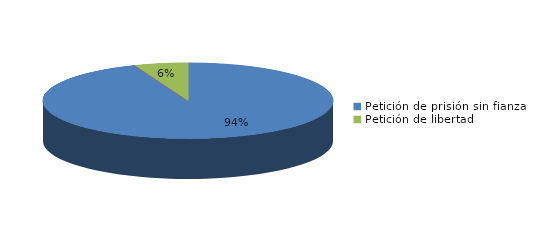
| Category | Series 0 |
|---|---|
| Petición de prisión sin fianza | 63 |
| Peticion de libertad con fianza | 0 |
| Petición de libertad | 4 |